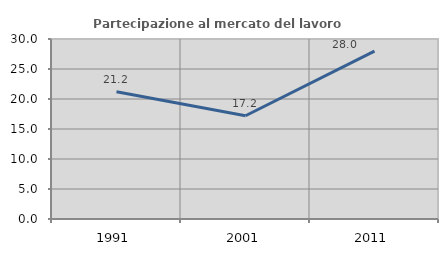
| Category | Partecipazione al mercato del lavoro  femminile |
|---|---|
| 1991.0 | 21.22 |
| 2001.0 | 17.208 |
| 2011.0 | 27.985 |